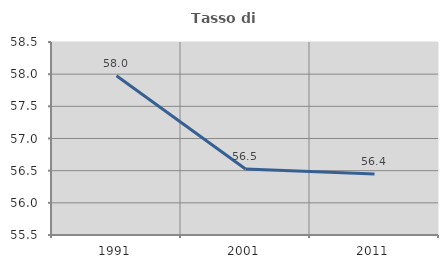
| Category | Tasso di occupazione   |
|---|---|
| 1991.0 | 57.975 |
| 2001.0 | 56.527 |
| 2011.0 | 56.447 |